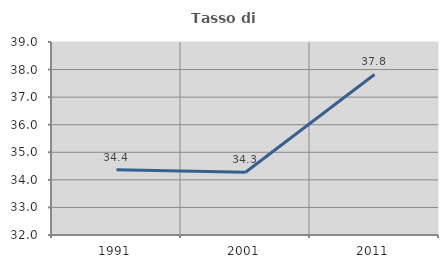
| Category | Tasso di occupazione   |
|---|---|
| 1991.0 | 34.364 |
| 2001.0 | 34.277 |
| 2011.0 | 37.823 |